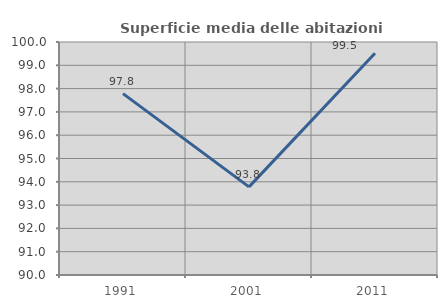
| Category | Superficie media delle abitazioni occupate |
|---|---|
| 1991.0 | 97.783 |
| 2001.0 | 93.781 |
| 2011.0 | 99.52 |